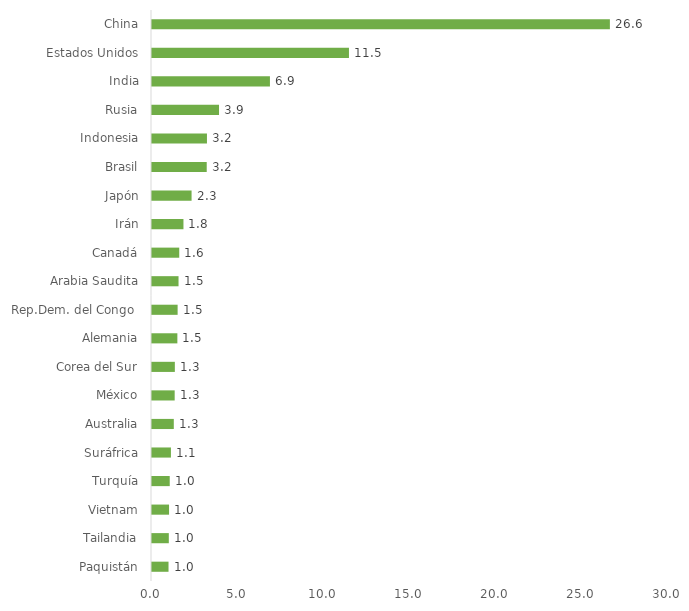
| Category | Series 0 |
|---|---|
| Paquistán | 0.96 |
| Tailandia | 0.977 |
| Vietnam | 0.992 |
| Turquía | 1.031 |
| Suráfrica | 1.101 |
| Australia | 1.267 |
| México | 1.319 |
| Corea del Sur | 1.328 |
| Alemania | 1.475 |
| Rep.Dem. del Congo  | 1.49 |
| Arabia Saudita | 1.543 |
| Canadá | 1.584 |
| Irán | 1.829 |
| Japón | 2.301 |
| Brasil | 3.182 |
| Indonesia | 3.195 |
| Rusia | 3.897 |
| India | 6.857 |
| Estados Unidos | 11.451 |
| China | 26.621 |